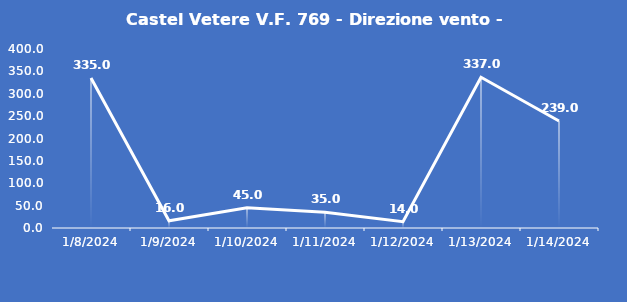
| Category | Castel Vetere V.F. 769 - Direzione vento - Grezzo (°N) |
|---|---|
| 1/8/24 | 335 |
| 1/9/24 | 16 |
| 1/10/24 | 45 |
| 1/11/24 | 35 |
| 1/12/24 | 14 |
| 1/13/24 | 337 |
| 1/14/24 | 239 |